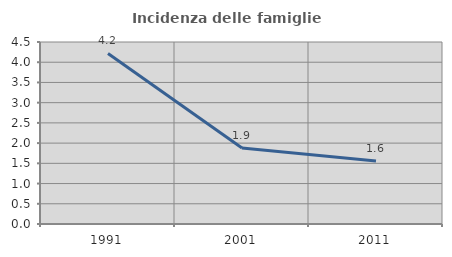
| Category | Incidenza delle famiglie numerose |
|---|---|
| 1991.0 | 4.216 |
| 2001.0 | 1.879 |
| 2011.0 | 1.56 |